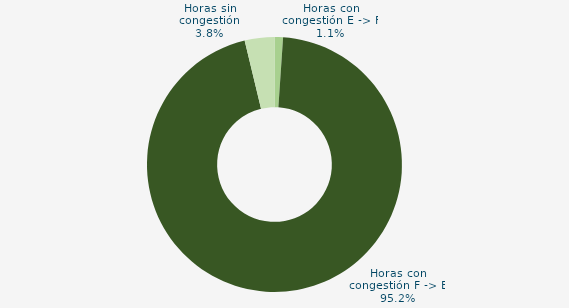
| Category | Horas con congestión E -> F |
|---|---|
| Horas con congestión E -> F | 1.075 |
| Horas con congestión F -> E | 95.161 |
| Horas sin congestión | 3.763 |